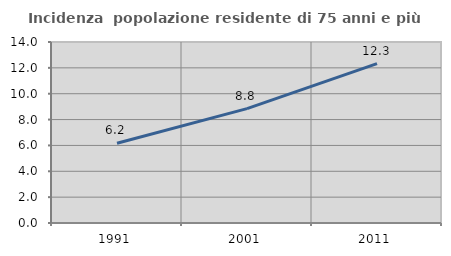
| Category | Incidenza  popolazione residente di 75 anni e più |
|---|---|
| 1991.0 | 6.171 |
| 2001.0 | 8.85 |
| 2011.0 | 12.329 |